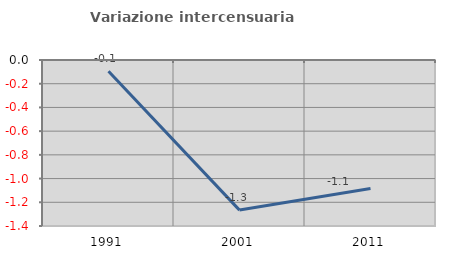
| Category | Variazione intercensuaria annua |
|---|---|
| 1991.0 | -0.095 |
| 2001.0 | -1.266 |
| 2011.0 | -1.084 |